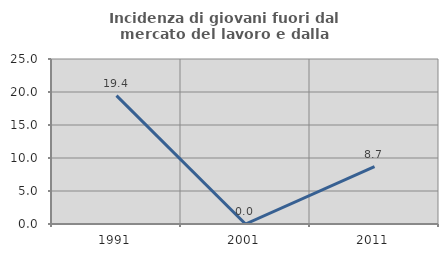
| Category | Incidenza di giovani fuori dal mercato del lavoro e dalla formazione  |
|---|---|
| 1991.0 | 19.444 |
| 2001.0 | 0 |
| 2011.0 | 8.696 |